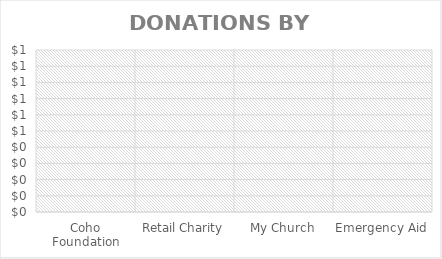
| Category | Donation |
|---|---|
| Coho Foundation | 750 |
| Retail Charity | 500 |
| My Church | 1000 |
| Emergency Aid | 800 |